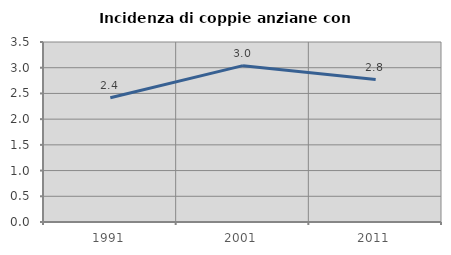
| Category | Incidenza di coppie anziane con figli |
|---|---|
| 1991.0 | 2.415 |
| 2001.0 | 3.04 |
| 2011.0 | 2.77 |